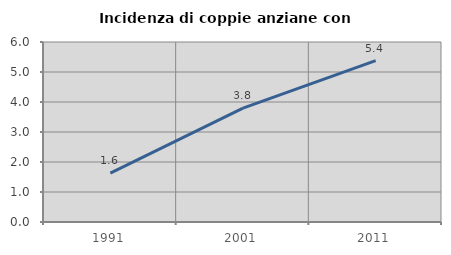
| Category | Incidenza di coppie anziane con figli |
|---|---|
| 1991.0 | 1.627 |
| 2001.0 | 3.794 |
| 2011.0 | 5.382 |